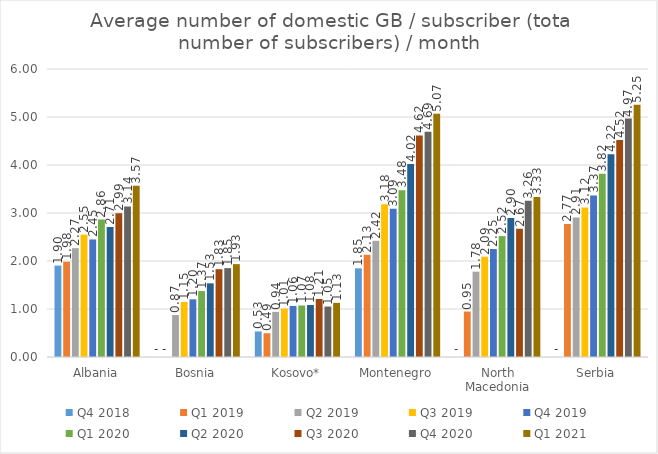
| Category | Q4 2018 | Q1 2019 | Q2 2019 | Q3 2019 | Q4 2019 | Q1 2020 | Q2 2020 | Q3 2020 | Q4 2020 | Q1 2021 |
|---|---|---|---|---|---|---|---|---|---|---|
| Albania | 1.904 | 1.984 | 2.267 | 2.549 | 2.449 | 2.863 | 2.709 | 2.995 | 3.136 | 3.566 |
| Bosnia | 0 | 0 | 0.874 | 1.145 | 1.202 | 1.374 | 1.535 | 1.83 | 1.851 | 1.935 |
| Kosovo* | 0.532 | 0.495 | 0.94 | 1.009 | 1.064 | 1.074 | 1.084 | 1.208 | 1.051 | 1.128 |
| Montenegro | 1.847 | 2.13 | 2.42 | 3.183 | 3.087 | 3.476 | 4.021 | 4.615 | 4.694 | 5.07 |
| North Macedonia | 0 | 0.948 | 1.778 | 2.089 | 2.25 | 2.519 | 2.897 | 2.673 | 3.257 | 3.333 |
| Serbia | 0 | 2.772 | 2.907 | 3.117 | 3.366 | 3.818 | 4.225 | 4.522 | 4.966 | 5.254 |